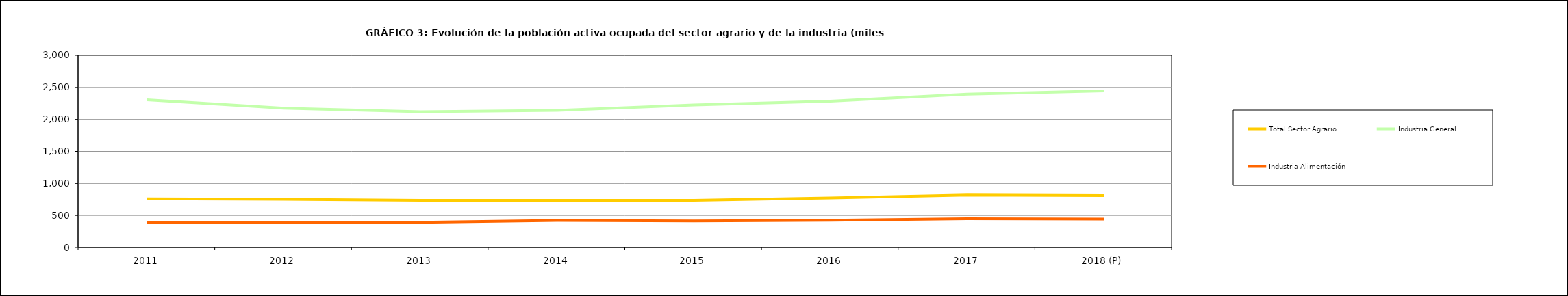
| Category | Total Sector Agrario | Industria General | Industria Alimentación |
|---|---|---|---|
| 2011 | 760.15 | 2304.9 | 393.05 |
| 2012 | 753.225 | 2175.575 | 388.925 |
| 2013 | 736.6 | 2118.7 | 393.3 |
| 2014 | 735.85 | 2141.4 | 420.65 |
| 2015 | 736.75 | 2225.025 | 414.025 |
| 2016 | 774.5 | 2284.2 | 423.7 |
| 2017 | 819.5 | 2393.4 | 448 |
| 2018 (P) | 812.575 | 2444.2 | 442.4 |